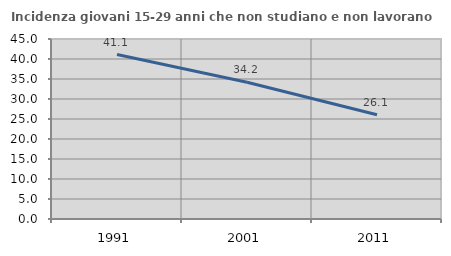
| Category | Incidenza giovani 15-29 anni che non studiano e non lavorano  |
|---|---|
| 1991.0 | 41.115 |
| 2001.0 | 34.206 |
| 2011.0 | 26.064 |